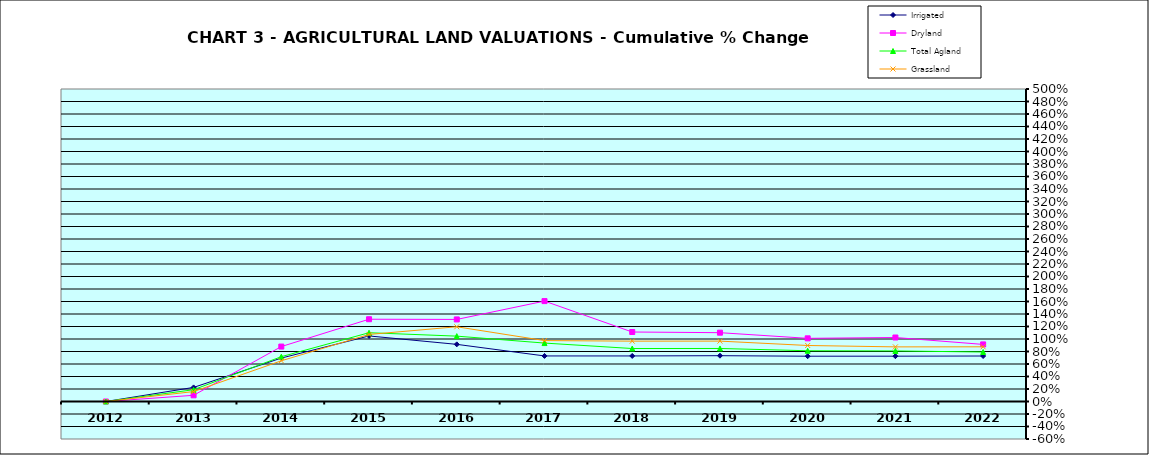
| Category | Irrigated | Dryland | Total Agland | Grassland |
|---|---|---|---|---|
| 2012.0 | 0 | 0 | 0 | 0 |
| 2013.0 | 0.225 | 0.099 | 0.189 | 0.159 |
| 2014.0 | 0.695 | 0.879 | 0.717 | 0.651 |
| 2015.0 | 1.049 | 1.316 | 1.1 | 1.073 |
| 2016.0 | 0.914 | 1.313 | 1.046 | 1.196 |
| 2017.0 | 0.729 | 1.606 | 0.935 | 0.975 |
| 2018.0 | 0.729 | 1.112 | 0.848 | 0.966 |
| 2019.0 | 0.733 | 1.101 | 0.848 | 0.966 |
| 2020.0 | 0.725 | 1.011 | 0.812 | 0.896 |
| 2021.0 | 0.725 | 1.024 | 0.809 | 0.874 |
| 2022.0 | 0.728 | 0.913 | 0.792 | 0.875 |